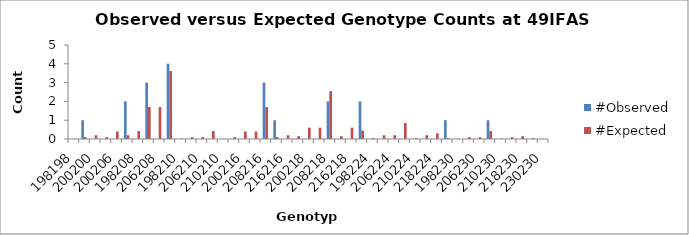
| Category | #Observed | #Expected |
|---|---|---|
| 198198.0 | 0 | 0.012 |
| 198200.0 | 1 | 0.1 |
| 200200.0 | 0 | 0.2 |
| 198206.0 | 0 | 0.1 |
| 200206.0 | 0 | 0.4 |
| 206206.0 | 2 | 0.2 |
| 198208.0 | 0 | 0.425 |
| 200208.0 | 3 | 1.7 |
| 206208.0 | 0 | 1.7 |
| 208208.0 | 4 | 3.612 |
| 198210.0 | 0 | 0.025 |
| 200210.0 | 0 | 0.1 |
| 206210.0 | 0 | 0.1 |
| 208210.0 | 0 | 0.425 |
| 210210.0 | 0 | 0.012 |
| 198216.0 | 0 | 0.1 |
| 200216.0 | 0 | 0.4 |
| 206216.0 | 0 | 0.4 |
| 208216.0 | 3 | 1.7 |
| 210216.0 | 1 | 0.1 |
| 216216.0 | 0 | 0.2 |
| 198218.0 | 0 | 0.15 |
| 200218.0 | 0 | 0.6 |
| 206218.0 | 0 | 0.6 |
| 208218.0 | 2 | 2.55 |
| 210218.0 | 0 | 0.15 |
| 216218.0 | 0 | 0.6 |
| 218218.0 | 2 | 0.45 |
| 198224.0 | 0 | 0.05 |
| 200224.0 | 0 | 0.2 |
| 206224.0 | 0 | 0.2 |
| 208224.0 | 0 | 0.85 |
| 210224.0 | 0 | 0.05 |
| 216224.0 | 0 | 0.2 |
| 218224.0 | 0 | 0.3 |
| 224224.0 | 1 | 0.05 |
| 198230.0 | 0 | 0.025 |
| 200230.0 | 0 | 0.1 |
| 206230.0 | 0 | 0.1 |
| 208230.0 | 1 | 0.425 |
| 210230.0 | 0 | 0.025 |
| 216230.0 | 0 | 0.1 |
| 218230.0 | 0 | 0.15 |
| 224230.0 | 0 | 0.05 |
| 230230.0 | 0 | 0.012 |